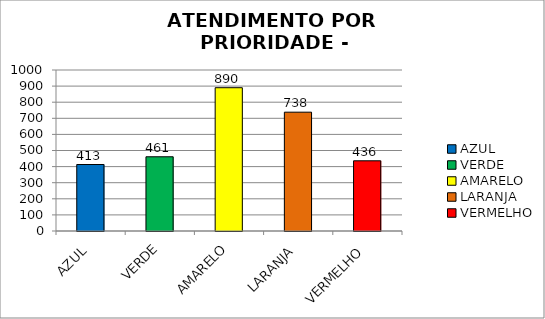
| Category | Total Regional: |
|---|---|
| AZUL | 413 |
| VERDE | 461 |
| AMARELO | 890 |
| LARANJA | 738 |
| VERMELHO | 436 |